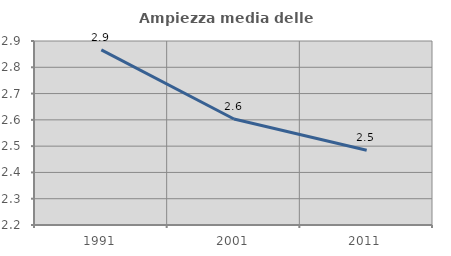
| Category | Ampiezza media delle famiglie |
|---|---|
| 1991.0 | 2.866 |
| 2001.0 | 2.603 |
| 2011.0 | 2.485 |